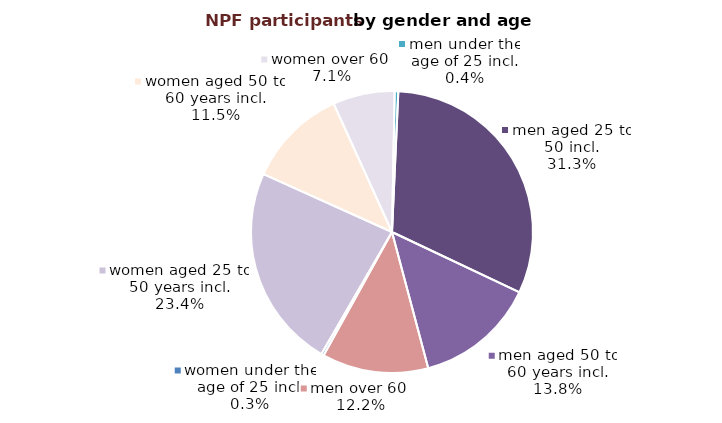
| Category | Series 0 |
|---|---|
| women under the age of 25 incl. | 2547 |
| women aged 25 to 50 years incl. | 203732 |
| women aged 50 to 60 years incl. | 99965 |
| women over 60  | 61818 |
| men under the age of 25 incl. | 3597 |
| men aged 25 to 50 incl. | 272824 |
| men aged 50 to 60 years incl. | 120470 |
| men over 60  | 106250 |